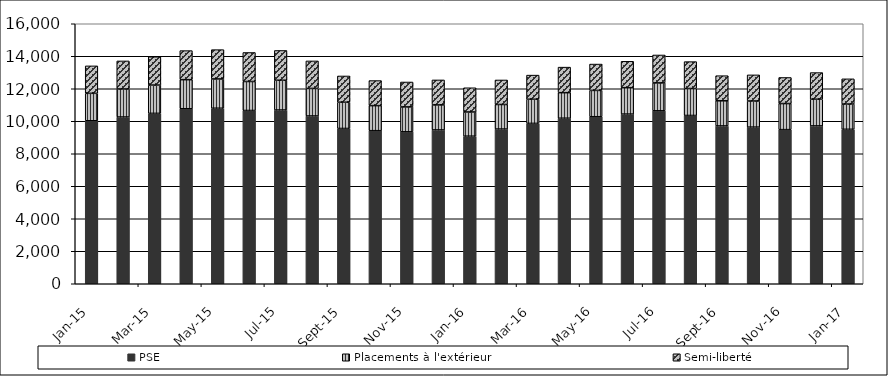
| Category | PSE | Placements à l'extérieur | Semi-liberté |
|---|---|---|---|
| 2015-01-01 | 10030 | 1689 | 1689 |
| 2015-02-01 | 10261 | 1726 | 1726 |
| 2015-03-01 | 10485 | 1742 | 1742 |
| 2015-04-01 | 10770 | 1789 | 1789 |
| 2015-05-01 | 10801 | 1803 | 1803 |
| 2015-06-01 | 10662 | 1785 | 1785 |
| 2015-07-01 | 10692 | 1832 | 1832 |
| 2015-08-01 | 10325 | 1694 | 1694 |
| 2015-09-01 | 9555 | 1616 | 1616 |
| 2015-10-01 | 9420 | 1542 | 1542 |
| 2015-11-01 | 9350 | 1533 | 1533 |
| 2015-12-01 | 9466 | 1539 | 1539 |
| 2016-01-01 | 9081 | 1490 | 1490 |
| 2016-02-01 | 9521 | 1510 | 1510 |
| 2016-03-01 | 9868 | 1486 | 1486 |
| 2016-04-01 | 10187 | 1572 | 1572 |
| 2016-05-01 | 10278 | 1621 | 1621 |
| 2016-06-01 | 10441 | 1625 | 1625 |
| 2016-07-01 | 10642 | 1718 | 1718 |
| 2016-08-01 | 10355 | 1658 | 1658 |
| 2016-09-01 | 9712 | 1546 | 1546 |
| 2016-10-01 | 9640 | 1607 | 1607 |
| 2016-11-01 | 9484 | 1605 | 1605 |
| 2016-12-01 | 9714 | 1641 | 1641 |
| 2017-01-01 | 9505 | 1553 | 1553 |